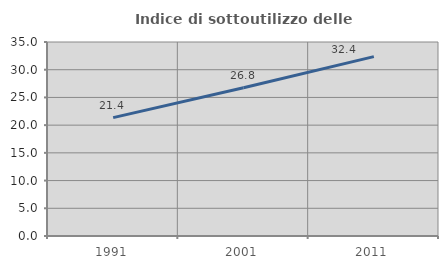
| Category | Indice di sottoutilizzo delle abitazioni  |
|---|---|
| 1991.0 | 21.35 |
| 2001.0 | 26.754 |
| 2011.0 | 32.36 |